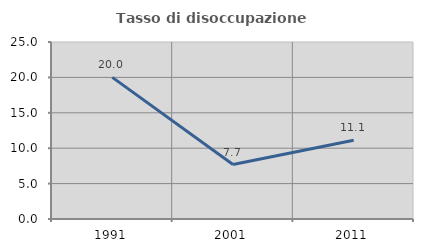
| Category | Tasso di disoccupazione giovanile  |
|---|---|
| 1991.0 | 20 |
| 2001.0 | 7.692 |
| 2011.0 | 11.111 |